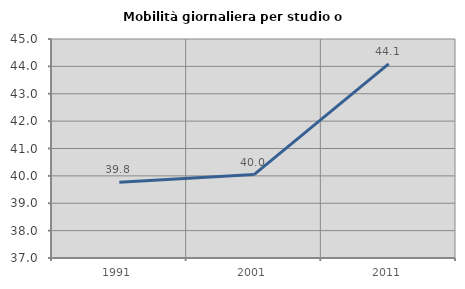
| Category | Mobilità giornaliera per studio o lavoro |
|---|---|
| 1991.0 | 39.768 |
| 2001.0 | 40.047 |
| 2011.0 | 44.092 |